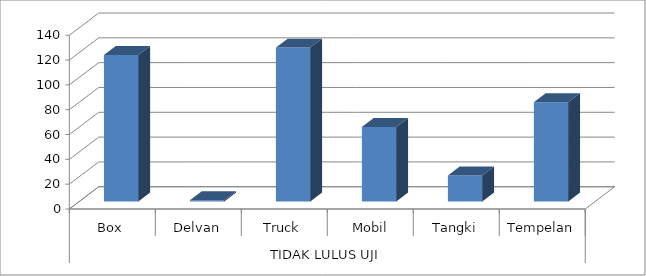
| Category | Series 0 |
|---|---|
| 0 | 118 |
| 1 | 1 |
| 2 | 124 |
| 3 | 60 |
| 4 | 21 |
| 5 | 80 |